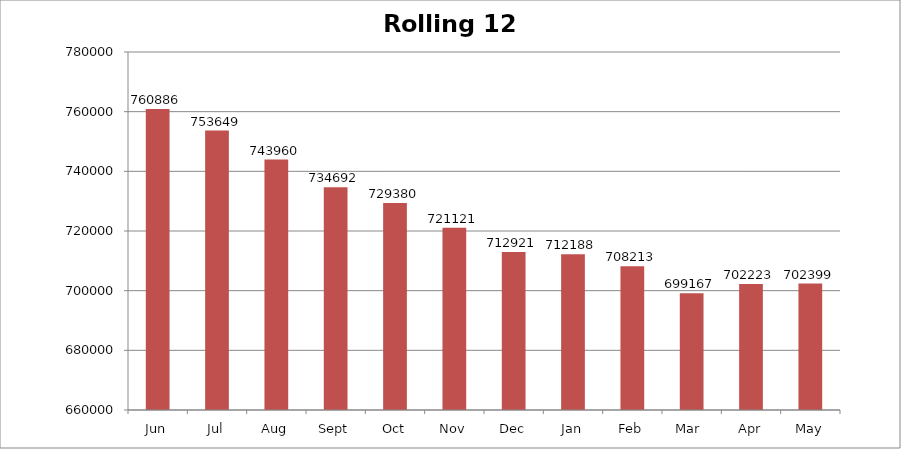
| Category | Rolling 12 Month |
|---|---|
| Jun | 760886 |
| Jul | 753649 |
| Aug | 743960 |
| Sept | 734692 |
| Oct | 729380 |
| Nov | 721121 |
| Dec | 712921 |
| Jan | 712188 |
| Feb | 708213 |
| Mar  | 699167 |
| Apr | 702223 |
| May | 702399 |